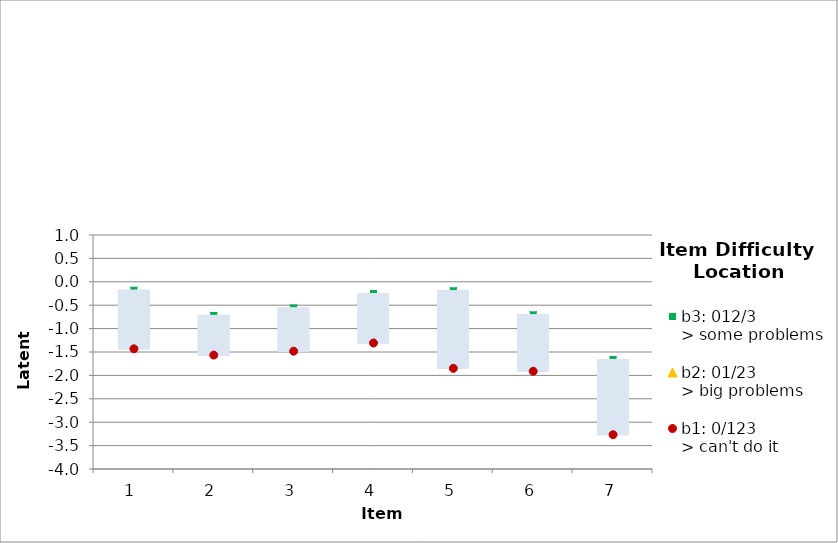
| Category | b3: 012/3
> some problems | b2: 01/23
> big problems | b1: 0/123
> can't do it |
|---|---|---|---|
| 1.0 | -0.181 | -0.944 | -1.433 |
| 2.0 | -0.719 | -1.214 | -1.566 |
| 3.0 | -0.558 | -1.126 | -1.483 |
| 4.0 | -0.25 | -0.813 | -1.307 |
| 5.0 | -0.192 | -0.855 | -1.85 |
| 6.0 | -0.706 | -1.237 | -1.912 |
| 7.0 | -1.66 | -2.474 | -3.268 |